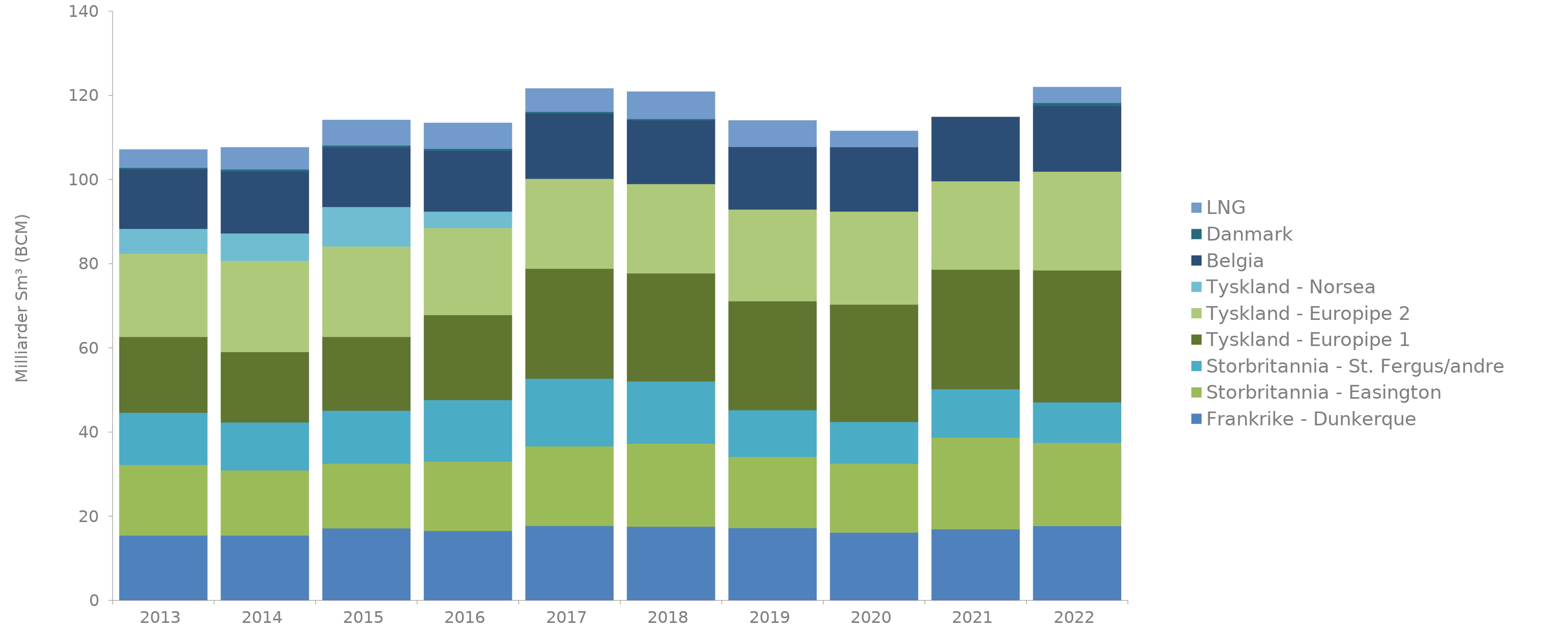
| Category | Frankrike - Dunkerque | Storbritannia - Easington | Storbritannia - St. Fergus/andre | Tyskland - Europipe 1 | Tyskland - Europipe 2 | Tyskland - Norsea | Belgia | Danmark | LNG |
|---|---|---|---|---|---|---|---|---|---|
| 2013.0 | 15.5 | 16.8 | 12.4 | 18 | 19.8 | 5.9 | 14.1 | 0.4 | 4.3 |
| 2014.0 | 15.5 | 15.5 | 11.4 | 16.7 | 21.7 | 6.5 | 14.7 | 0.5 | 5.2 |
| 2015.0 | 17.2 | 15.4 | 12.6 | 17.5 | 21.5 | 9.4 | 14.1 | 0.5 | 6 |
| 2016.0 | 16.6 | 16.5 | 14.6 | 20.2 | 20.7 | 3.9 | 14.4 | 0.5 | 6.1 |
| 2017.0 | 17.8 | 18.9 | 16.1 | 26.1 | 21.4 | 0 | 15.5 | 0.4 | 5.5 |
| 2018.0 | 17.61 | 19.73 | 14.82 | 25.67 | 21.21 | 0 | 15.15 | 0.3 | 6.45 |
| 2019.0 | 17.3 | 16.9 | 11.1 | 25.9 | 21.8 | 0 | 14.7 | 0.2 | 6.2 |
| 2020.0 | 16.2 | 16.4 | 9.9 | 27.9 | 22.1 | 0 | 15.3 | 0 | 3.8 |
| 2021.0 | 17 | 21.8 | 11.5 | 28.4 | 21 | 0 | 15.2 | 0 | 0 |
| 2022.0 | 17.76 | 19.8 | 9.6 | 31.35 | 23.47 | 0 | 15.59 | 0.76 | 3.69 |